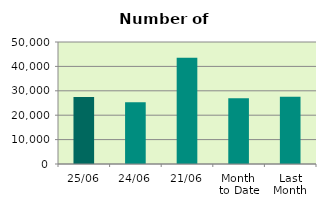
| Category | Series 0 |
|---|---|
| 25/06 | 27478 |
| 24/06 | 25284 |
| 21/06 | 43592 |
| Month 
to Date | 26944 |
| Last
Month | 27522.455 |